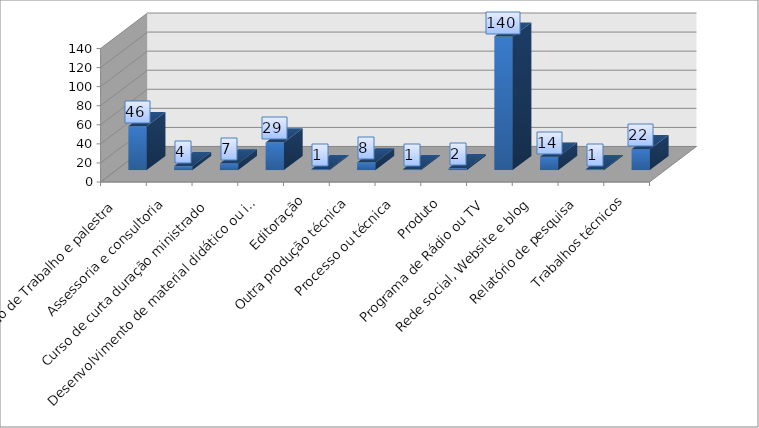
| Category | Total de produções |
|---|---|
| Apresentação de Trabalho e palestra | 46 |
| Assessoria e consultoria | 4 |
| Curso de curta duração ministrado | 7 |
| Desenvolvimento de material didático ou instrucional | 29 |
| Editoração | 1 |
| Outra produção técnica | 8 |
| Processo ou técnica | 1 |
| Produto | 2 |
| Programa de Rádio ou TV | 140 |
| Rede social, Website e blog | 14 |
| Relatório de pesquisa | 1 |
| Trabalhos técnicos | 22 |